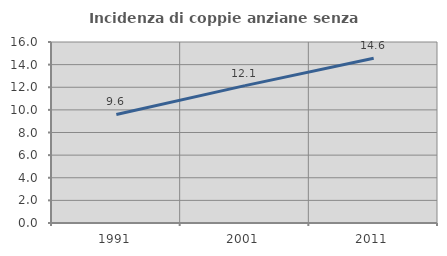
| Category | Incidenza di coppie anziane senza figli  |
|---|---|
| 1991.0 | 9.594 |
| 2001.0 | 12.141 |
| 2011.0 | 14.565 |